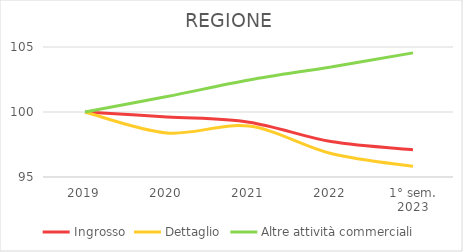
| Category | Ingrosso | Dettaglio | Altre attività commerciali |
|---|---|---|---|
| 2019 | 100 | 100 | 100 |
| 2020 | 99.621 | 98.388 | 101.188 |
| 2021 | 99.218 | 98.915 | 102.459 |
| 2022 | 97.727 | 96.811 | 103.469 |
| 1° sem.
2023 | 97.103 | 95.817 | 104.549 |